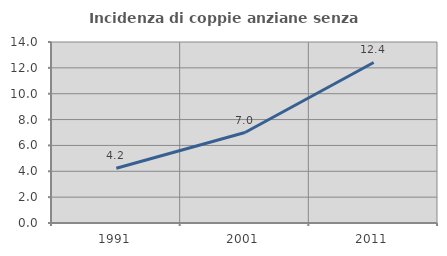
| Category | Incidenza di coppie anziane senza figli  |
|---|---|
| 1991.0 | 4.238 |
| 2001.0 | 6.996 |
| 2011.0 | 12.415 |